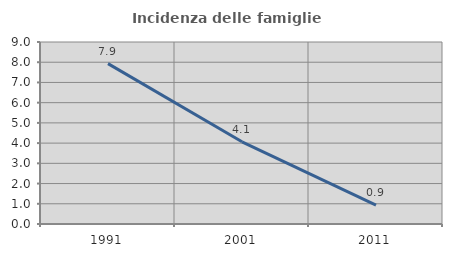
| Category | Incidenza delle famiglie numerose |
|---|---|
| 1991.0 | 7.932 |
| 2001.0 | 4.066 |
| 2011.0 | 0.929 |